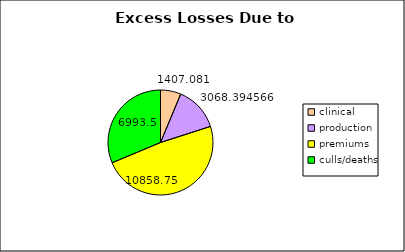
| Category | Losses |
|---|---|
| clinical | 1407.081 |
| production | 3068.395 |
| premiums | 10858.75 |
| culls/deaths | 6993.5 |